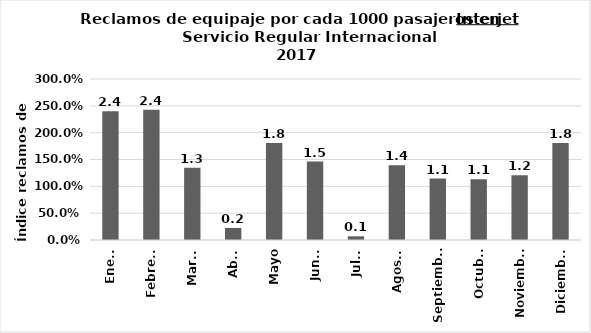
| Category | Reclamos por cada 1000 pasajeros |
|---|---|
| Enero | 2.401 |
| Febrero | 2.428 |
| Marzo | 1.348 |
| Abril | 0.225 |
| Mayo | 1.808 |
| Junio | 1.461 |
| Julio | 0.068 |
| Agosto | 1.391 |
| Septiembre | 1.144 |
| Octubre | 1.134 |
| Noviembre | 1.206 |
| Diciembre | 1.807 |